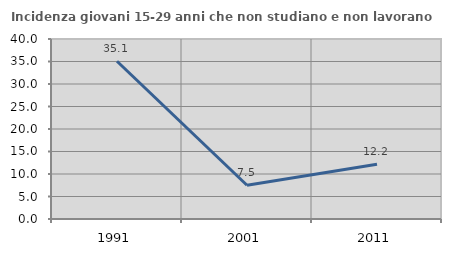
| Category | Incidenza giovani 15-29 anni che non studiano e non lavorano  |
|---|---|
| 1991.0 | 35.052 |
| 2001.0 | 7.503 |
| 2011.0 | 12.159 |